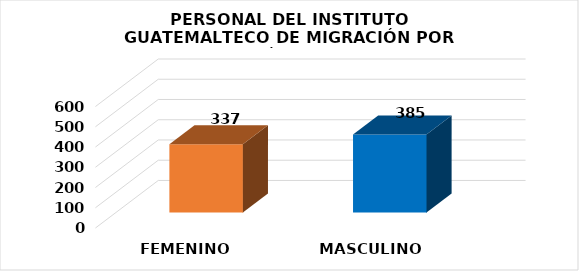
| Category | Series 0 |
|---|---|
| FEMENINO | 337 |
| MASCULINO | 385 |